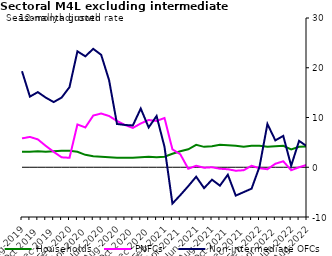
| Category | zero | Households | PNFCs | Non-intermediate OFCs |
|---|---|---|---|---|
| Aug-2019 | 0 | 3.1 | 5.8 | 19.3 |
| Sep-2019 | 0 | 3.1 | 6.1 | 14.2 |
| Oct-2019 | 0 | 3.2 | 5.6 | 15.1 |
| Nov-2019 | 0 | 3.1 | 4.3 | 14 |
| Dec-2019 | 0 | 3.2 | 3.1 | 13.1 |
| Jan-2020 | 0 | 3.3 | 2 | 14 |
| Feb-2020 | 0 | 3.3 | 1.9 | 16.1 |
| Mar-2020 | 0 | 3.1 | 8.6 | 23.3 |
| Apr-2020 | 0 | 2.5 | 8 | 22.3 |
| May-2020 | 0 | 2.2 | 10.4 | 23.8 |
| Jun-2020 | 0 | 2.1 | 10.8 | 22.6 |
| Jul-2020 | 0 | 2 | 10.3 | 17.5 |
| Aug-2020 | 0 | 1.9 | 9.3 | 8.7 |
| Sep-2020 | 0 | 1.9 | 8.5 | 8.5 |
| Oct-2020 | 0 | 1.9 | 7.9 | 8.4 |
| Nov-2020 | 0 | 2 | 8.8 | 11.8 |
| Dec-2020 | 0 | 2.1 | 9.5 | 8 |
| Jan-2021 | 0 | 2 | 9.3 | 10.3 |
| Feb-2021 | 0 | 2.1 | 9.9 | 4.1 |
| Mar-2021 | 0 | 2.7 | 3.6 | -7.3 |
| Apr-2021 | 0 | 3.2 | 2.6 | -5.6 |
| May-2021 | 0 | 3.6 | -0.3 | -3.8 |
| Jun-2021 | 0 | 4.5 | 0.3 | -1.9 |
| Jul-2021 | 0 | 4.1 | -0.1 | -4.2 |
| Aug-2021 | 0 | 4.2 | 0 | -2.5 |
| Sep-2021 | 0 | 4.5 | -0.3 | -3.7 |
| Oct-2021 | 0 | 4.4 | -0.4 | -1.5 |
| Nov-2021 | 0 | 4.3 | -0.7 | -5.7 |
| Dec-2021 | 0 | 4.1 | -0.6 | -5 |
| Jan-2022 | 0 | 4.3 | 0.3 | -4.3 |
| Feb-2022 | 0 | 4.3 | -0.2 | 0.1 |
| Mar-2022 | 0 | 4.1 | -0.4 | 8.7 |
| Apr-2022 | 0 | 4.2 | 0.7 | 5.4 |
| May-2022 | 0 | 4.3 | 1.2 | 6.3 |
| Jun-2022 | 0 | 3.6 | -0.6 | 0.3 |
| Jul-2022 | 0 | 4.1 | 0 | 5.3 |
| Aug-2022 | 0 | 4.2 | 0.5 | 4.2 |